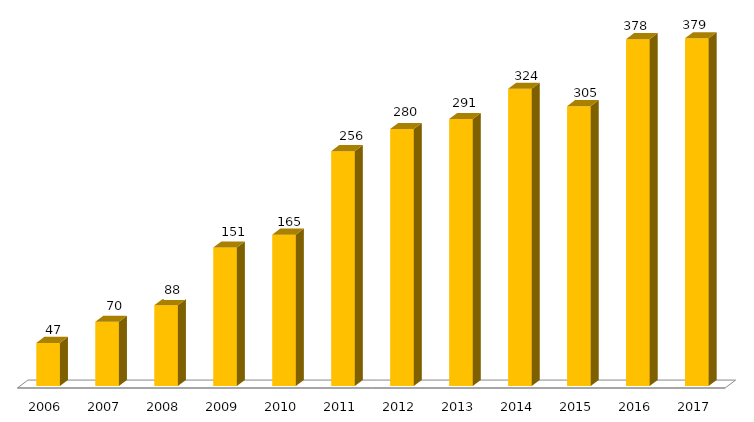
| Category | Programa |
|---|---|
| 2006.0 | 47 |
| 2007.0 | 70 |
| 2008.0 | 88 |
| 2009.0 | 151 |
| 2010.0 | 165 |
| 2011.0 | 256 |
| 2012.0 | 280 |
| 2013.0 | 291 |
| 2014.0 | 324 |
| 2015.0 | 305 |
| 2016.0 | 378 |
| 2017.0 | 379 |